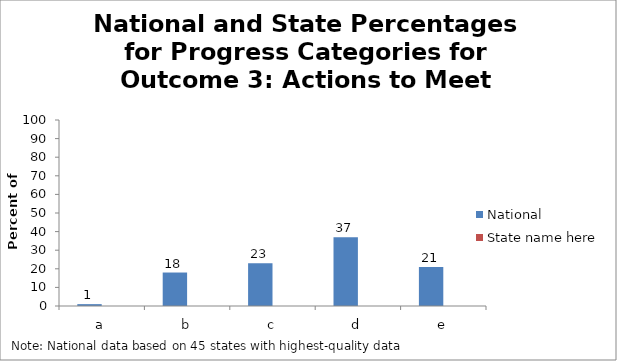
| Category | National | State name here |
|---|---|---|
| a | 1 |  |
| b | 18 |  |
| c | 23 |  |
| d | 37 |  |
| e | 21 |  |